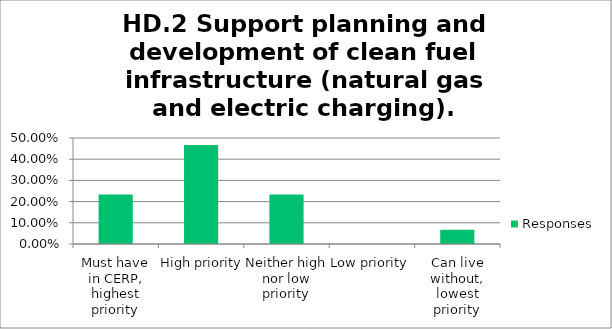
| Category | Responses |
|---|---|
| Must have in CERP, highest priority | 0.233 |
| High priority | 0.467 |
| Neither high nor low priority | 0.233 |
| Low priority | 0 |
| Can live without, lowest priority | 0.067 |